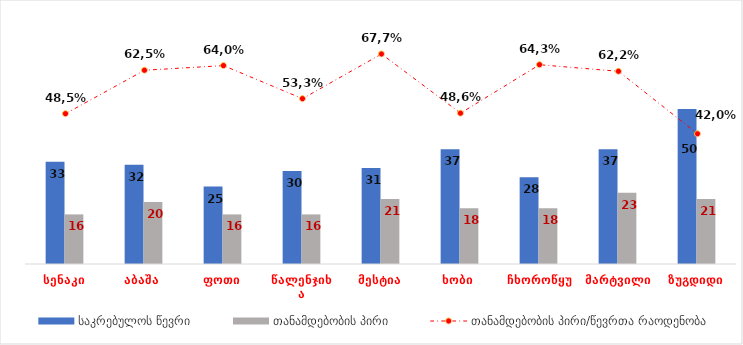
| Category | Series 0 | Series 1 | Series 2 | Series 3 | საკრებულოს წევრი | Series 5 | თანამდებობის პირი | Series 7 |
|---|---|---|---|---|---|---|---|---|
| სენაკი |  |  |  |  | 33 |  | 16 |  |
| აბაშა |  |  |  |  | 32 |  | 20 |  |
| ფოთი |  |  |  |  | 25 |  | 16 |  |
| წალენჯიხა |  |  |  |  | 30 |  | 16 |  |
| მესტია |  |  |  |  | 31 |  | 21 |  |
| ხობი |  |  |  |  | 37 |  | 18 |  |
| ჩხოროწყუ |  |  |  |  | 28 |  | 18 |  |
| მარტვილი |  |  |  |  | 37 |  | 23 |  |
| ზუგდიდი |  |  |  |  | 50 |  | 21 |  |